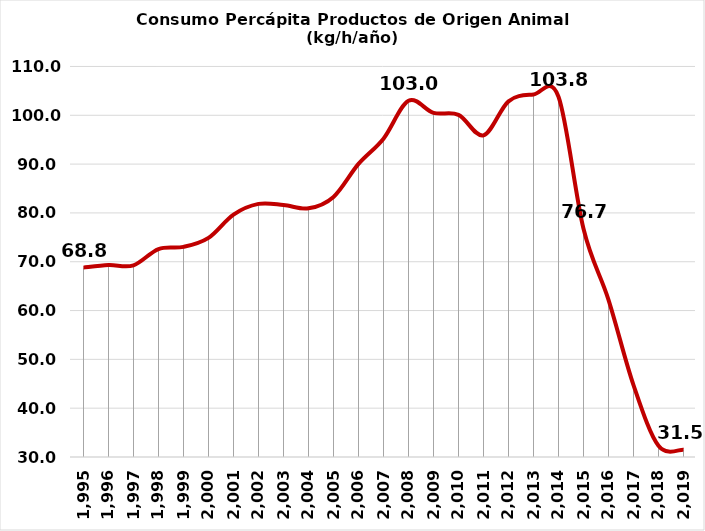
| Category | CONSUMO PERCAPITA TOTAL* (kg/h/año) |
|---|---|
| 1995.0 | 68.795 |
| 1996.0 | 69.318 |
| 1997.0 | 69.271 |
| 1998.0 | 72.598 |
| 1999.0 | 73.038 |
| 2000.0 | 74.894 |
| 2001.0 | 79.658 |
| 2002.0 | 81.845 |
| 2003.0 | 81.623 |
| 2004.0 | 80.938 |
| 2005.0 | 83.284 |
| 2006.0 | 90.051 |
| 2007.0 | 95.213 |
| 2008.0 | 102.966 |
| 2009.0 | 100.493 |
| 2010.0 | 100.092 |
| 2011.0 | 95.886 |
| 2012.0 | 102.858 |
| 2013.0 | 104.245 |
| 2014.0 | 103.8 |
| 2015.0 | 76.74 |
| 2016.0 | 62.203 |
| 2017.0 | 44.728 |
| 2018.0 | 32.291 |
| 2019.0 | 31.503 |